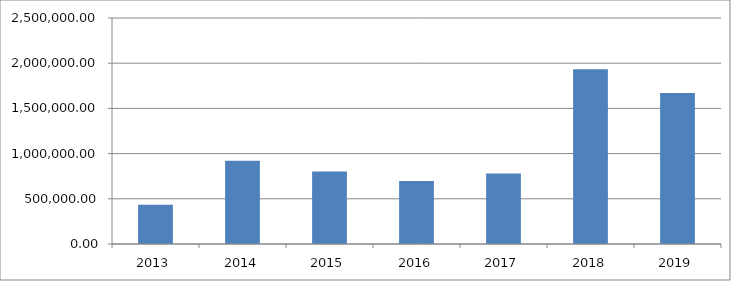
| Category | Series 0 |
|---|---|
| 2013.0 | 433211.104 |
| 2014.0 | 921869.247 |
| 2015.0 | 800670.293 |
| 2016.0 | 695673.661 |
| 2017.0 | 780097.563 |
| 2018.0 | 1932861.01 |
| 2019.0 | 1671214.263 |